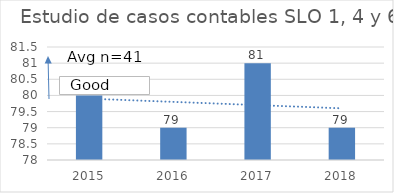
| Category | Series 0 |
|---|---|
| 2015.0 | 80 |
| 2016.0 | 79 |
| 2017.0 | 81 |
| 2018.0 | 79 |